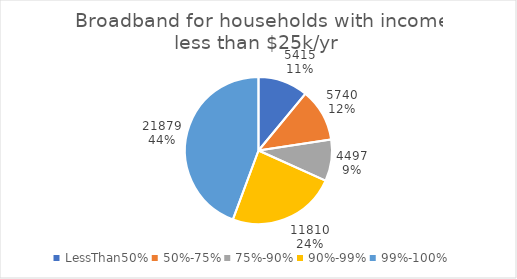
| Category | LessThan25K |
|---|---|
| LessThan50% | 5415 |
| 50%-75% | 5740 |
| 75%-90% | 4497 |
| 90%-99% | 11810 |
| 99%-100% | 21879 |